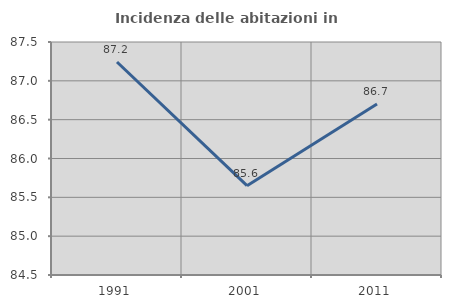
| Category | Incidenza delle abitazioni in proprietà  |
|---|---|
| 1991.0 | 87.242 |
| 2001.0 | 85.65 |
| 2011.0 | 86.701 |